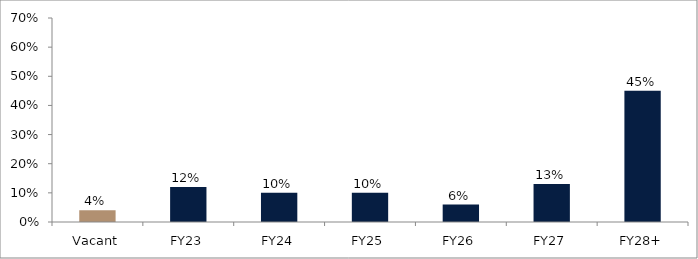
| Category | Series 0 |
|---|---|
| Vacant | 0.04 |
| FY23 | 0.12 |
| FY24 | 0.1 |
| FY25 | 0.1 |
| FY26 | 0.06 |
| FY27 | 0.13 |
| FY28+ | 0.45 |